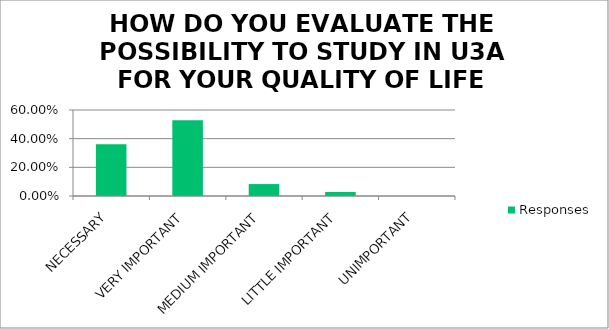
| Category | Responses |
|---|---|
| NECESSARY | 0.361 |
| VERY IMPORTANT | 0.528 |
| MEDIUM IMPORTANT | 0.083 |
| LITTLE IMPORTANT | 0.028 |
| UNIMPORTANT | 0 |